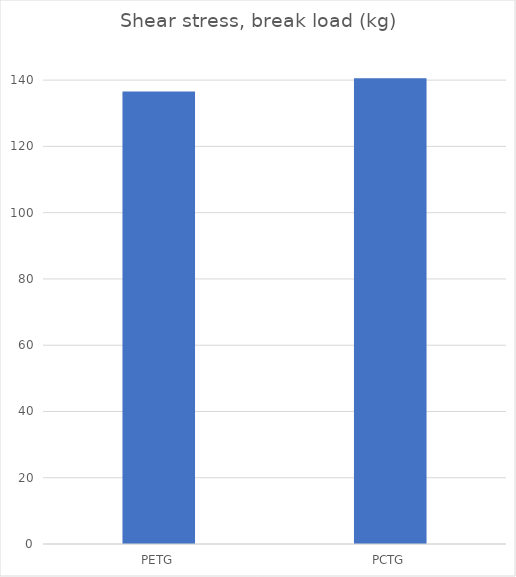
| Category | Break kg |
|---|---|
| PETG | 136.6 |
| PCTG | 140.6 |